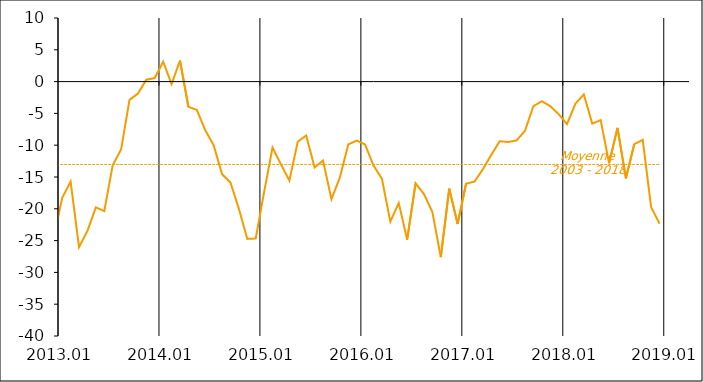
| Category | Series 1 | Moyenne
2003 - 2018 |
|---|---|---|
| 2003-01-20 | -13 | -13.025 |
| 2003-02-20 | -26 | -13.025 |
| 2003-03-20 | -28 | -13.025 |
| 2003-04-20 | -14 | -13.025 |
| 2003-05-20 | -6 | -13.025 |
| 2003-06-20 | -11 | -13.025 |
| 2003-07-20 | -6 | -13.025 |
| 2003-08-20 | -7 | -13.025 |
| 2003-09-20 | -3 | -13.025 |
| 2003-10-20 | -8 | -13.025 |
| 2003-11-20 | 3 | -13.025 |
| 2003-12-20 | -4 | -13.025 |
| 2004-01-20 | -2 | -13.025 |
| 2004-02-20 | 2 | -13.025 |
| 2004-03-20 | -2 | -13.025 |
| 2004-04-20 | -4 | -13.025 |
| 2004-05-20 | -7 | -13.025 |
| 2004-06-20 | 0 | -13.025 |
| 2004-07-20 | -6 | -13.025 |
| 2004-08-20 | -3 | -13.025 |
| 2004-09-20 | -5 | -13.025 |
| 2004-10-20 | -14 | -13.025 |
| 2004-11-20 | -11 | -13.025 |
| 2004-12-20 | -5 | -13.025 |
| 2005-01-20 | -12 | -13.025 |
| 2005-02-20 | -8 | -13.025 |
| 2005-03-20 | -5 | -13.025 |
| 2005-04-20 | -14 | -13.025 |
| 2005-05-20 | -15 | -13.025 |
| 2005-06-20 | -17 | -13.025 |
| 2005-07-20 | -21 | -13.025 |
| 2005-08-20 | -18 | -13.025 |
| 2005-09-20 | -31 | -13.025 |
| 2005-10-20 | -17 | -13.025 |
| 2005-11-20 | -13 | -13.025 |
| 2005-12-20 | -11 | -13.025 |
| 2006-01-20 | -11 | -13.025 |
| 2006-02-20 | -15 | -13.025 |
| 2006-03-20 | -13 | -13.025 |
| 2006-04-20 | -15 | -13.025 |
| 2006-05-20 | -16 | -13.025 |
| 2006-06-20 | -10 | -13.025 |
| 2006-07-20 | -6 | -13.025 |
| 2006-08-20 | -12 | -13.025 |
| 2006-09-20 | -9 | -13.025 |
| 2006-10-20 | -8 | -13.025 |
| 2006-11-20 | -5 | -13.025 |
| 2006-12-20 | -15 | -13.025 |
| 2007-01-20 | -13 | -13.025 |
| 2007-02-20 | -8 | -13.025 |
| 2007-03-20 | -9 | -13.025 |
| 2007-04-20 | -4 | -13.025 |
| 2007-05-20 | -1 | -13.025 |
| 2007-06-20 | -4 | -13.025 |
| 2007-07-20 | -6 | -13.025 |
| 2007-08-20 | -16 | -13.025 |
| 2007-09-20 | -12 | -13.025 |
| 2007-10-20 | -11 | -13.025 |
| 2007-11-20 | -31 | -13.025 |
| 2007-12-20 | -23 | -13.025 |
| 2008-01-20 | -26 | -13.025 |
| 2008-02-20 | -23 | -13.025 |
| 2008-03-20 | -19 | -13.025 |
| 2008-04-20 | -26 | -13.025 |
| 2008-05-20 | -33 | -13.025 |
| 2008-06-20 | -37 | -13.025 |
| 2008-07-20 | -35 | -13.025 |
| 2008-08-20 | -24 | -13.025 |
| 2008-09-20 | -22 | -13.025 |
| 2008-10-20 | -27 | -13.025 |
| 2008-11-20 | -20 | -13.025 |
| 2008-12-20 | -26 | -13.025 |
| 2009-01-20 | -19 | -13.025 |
| 2009-02-20 | -29 | -13.025 |
| 2009-03-20 | -24 | -13.025 |
| 2009-04-20 | -21 | -13.025 |
| 2009-05-20 | -14 | -13.025 |
| 2009-06-20 | -13 | -13.025 |
| 2009-07-20 | -12 | -13.025 |
| 2009-08-20 | -4 | -13.025 |
| 2009-09-20 | -5 | -13.025 |
| 2009-10-20 | -9 | -13.025 |
| 2009-11-20 | 0 | -13.025 |
| 2009-12-20 | -7 | -13.025 |
| 2010-01-20 | -16 | -13.025 |
| 2010-02-20 | -8 | -13.025 |
| 2010-03-20 | -5 | -13.025 |
| 2010-04-20 | -3 | -13.025 |
| 2010-05-20 | -19 | -13.025 |
| 2010-06-20 | -14 | -13.025 |
| 2010-07-20 | -4 | -13.025 |
| 2010-08-20 | -8 | -13.025 |
| 2010-09-20 | -12 | -13.025 |
| 2010-10-20 | -14 | -13.025 |
| 2010-11-20 | -9 | -13.025 |
| 2010-12-20 | -10 | -13.025 |
| 2011-01-20 | -18 | -13.025 |
| 2011-02-20 | -13 | -13.025 |
| 2011-03-20 | -16 | -13.025 |
| 2011-04-20 | -16 | -13.025 |
| 2011-05-20 | -8 | -13.025 |
| 2011-06-20 | -13 | -13.025 |
| 2011-07-20 | -18 | -13.025 |
| 2011-08-20 | -17 | -13.025 |
| 2011-09-20 | -14 | -13.025 |
| 2011-10-20 | -9 | -13.025 |
| 2011-11-20 | -22 | -13.025 |
| 2011-12-20 | -9 | -13.025 |
| 2012-01-20 | -27 | -13.025 |
| 2012-02-20 | -29 | -13.025 |
| 2012-03-20 | -14 | -13.025 |
| 2012-04-20 | -16 | -13.025 |
| 2012-05-20 | -12 | -13.025 |
| 2012-06-20 | -14 | -13.025 |
| 2012-07-20 | -8 | -13.025 |
| 2012-08-20 | -12 | -13.025 |
| 2012-09-20 | -11 | -13.025 |
| 2012-10-20 | -18 | -13.025 |
| 2012-11-20 | -30.798 | -13.025 |
| 2012-12-20 | -24.498 | -13.025 |
| 2013-01-20 | -18.26 | -13.025 |
| 2013-02-20 | -15.723 | -13.025 |
| 2013-03-20 | -26.029 | -13.025 |
| 2013-04-20 | -23.475 | -13.025 |
| 2013-05-20 | -19.78 | -13.025 |
| 2013-06-20 | -20.36 | -13.025 |
| 2013-07-20 | -13.172 | -13.025 |
| 2013-08-20 | -10.669 | -13.025 |
| 2013-09-20 | -2.865 | -13.025 |
| 2013-10-20 | -1.885 | -13.025 |
| 2013-11-20 | 0.301 | -13.025 |
| 2013-12-20 | 0.563 | -13.025 |
| 2014-01-20 | 3.126 | -13.025 |
| 2014-02-20 | -0.396 | -13.025 |
| 2014-03-20 | 3.306 | -13.025 |
| 2014-04-20 | -3.952 | -13.025 |
| 2014-05-20 | -4.448 | -13.025 |
| 2014-06-20 | -7.64 | -13.025 |
| 2014-07-20 | -10.008 | -13.025 |
| 2014-08-20 | -14.556 | -13.025 |
| 2014-09-20 | -15.876 | -13.025 |
| 2014-10-20 | -20.004 | -13.025 |
| 2014-11-20 | -24.734 | -13.025 |
| 2014-12-20 | -24.673 | -13.025 |
| 2015-01-20 | -17.353 | -13.025 |
| 2015-02-20 | -10.357 | -13.025 |
| 2015-03-20 | -13.009 | -13.025 |
| 2015-04-20 | -15.559 | -13.025 |
| 2015-05-20 | -9.443 | -13.025 |
| 2015-06-20 | -8.481 | -13.025 |
| 2015-07-20 | -13.509 | -13.025 |
| 2015-08-20 | -12.414 | -13.025 |
| 2015-09-20 | -18.493 | -13.025 |
| 2015-10-20 | -15.086 | -13.025 |
| 2015-11-20 | -9.88 | -13.025 |
| 2015-12-20 | -9.275 | -13.025 |
| 2016-01-20 | -9.891 | -13.025 |
| 2016-02-20 | -13.191 | -13.025 |
| 2016-03-20 | -15.275 | -13.025 |
| 2016-04-20 | -22.018 | -13.025 |
| 2016-05-20 | -19.091 | -13.025 |
| 2016-06-20 | -24.851 | -13.025 |
| 2016-07-20 | -15.987 | -13.025 |
| 2016-08-20 | -17.674 | -13.025 |
| 2016-09-20 | -20.522 | -13.025 |
| 2016-10-20 | -27.61 | -13.025 |
| 2016-11-20 | -16.826 | -13.025 |
| 2016-12-20 | -22.381 | -13.025 |
| 2017-01-20 | -16.053 | -13.025 |
| 2017-02-20 | -15.728 | -13.025 |
| 2017-03-20 | -13.787 | -13.025 |
| 2017-04-20 | -11.515 | -13.025 |
| 2017-05-20 | -9.373 | -13.025 |
| 2017-06-20 | -9.497 | -13.025 |
| 2017-07-20 | -9.253 | -13.025 |
| 2017-08-20 | -7.748 | -13.025 |
| 2017-09-20 | -3.879 | -13.025 |
| 2017-10-20 | -3.085 | -13.025 |
| 2017-11-20 | -3.846 | -13.025 |
| 2017-12-20 | -5.114 | -13.025 |
| 2018-01-20 | -6.673 | -13.025 |
| 2018-02-20 | -3.474 | -13.025 |
| 2018-03-20 | -2.015 | -13.025 |
| 2018-04-20 | -6.609 | -13.025 |
| 2018-05-20 | -6.054 | -13.025 |
| 2018-06-20 | -12.83 | -13.025 |
| 2018-07-20 | -7.275 | -13.025 |
| 2018-08-20 | -15.206 | -13.025 |
| 2018-09-20 | -9.829 | -13.025 |
| 2018-10-20 | -9.148 | -13.025 |
| 2018-11-20 | -19.75 | -13.025 |
| 2018-12-20 | -22.334 | -13.025 |